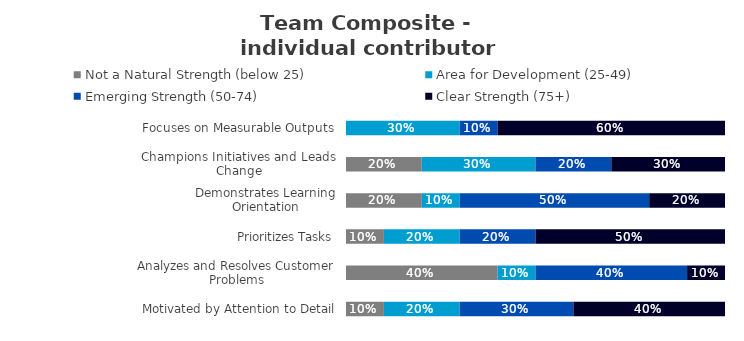
| Category | Not a Natural Strength (below 25) | Area for Development (25-49) | Emerging Strength (50-74) | Clear Strength (75+) |
|---|---|---|---|---|
| Focuses on Measurable Outputs | 0 | 0.3 | 0.1 | 0.6 |
| Champions Initiatives and Leads Change | 0.2 | 0.3 | 0.2 | 0.3 |
| Demonstrates Learning Orientation | 0.2 | 0.1 | 0.5 | 0.2 |
| Prioritizes Tasks | 0.1 | 0.2 | 0.2 | 0.5 |
| Analyzes and Resolves Customer Problems | 0.4 | 0.1 | 0.4 | 0.1 |
| Motivated by Attention to Detail | 0.1 | 0.2 | 0.3 | 0.4 |